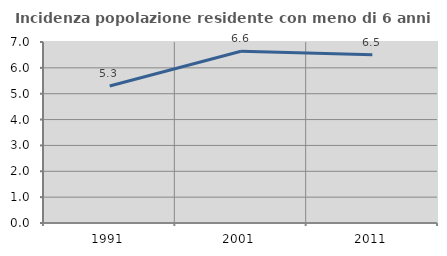
| Category | Incidenza popolazione residente con meno di 6 anni |
|---|---|
| 1991.0 | 5.297 |
| 2001.0 | 6.641 |
| 2011.0 | 6.504 |